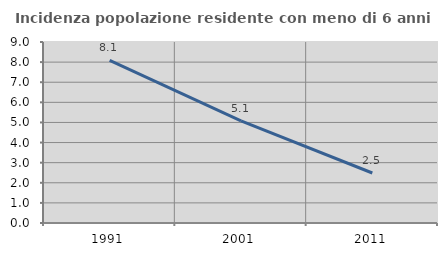
| Category | Incidenza popolazione residente con meno di 6 anni |
|---|---|
| 1991.0 | 8.083 |
| 2001.0 | 5.078 |
| 2011.0 | 2.486 |